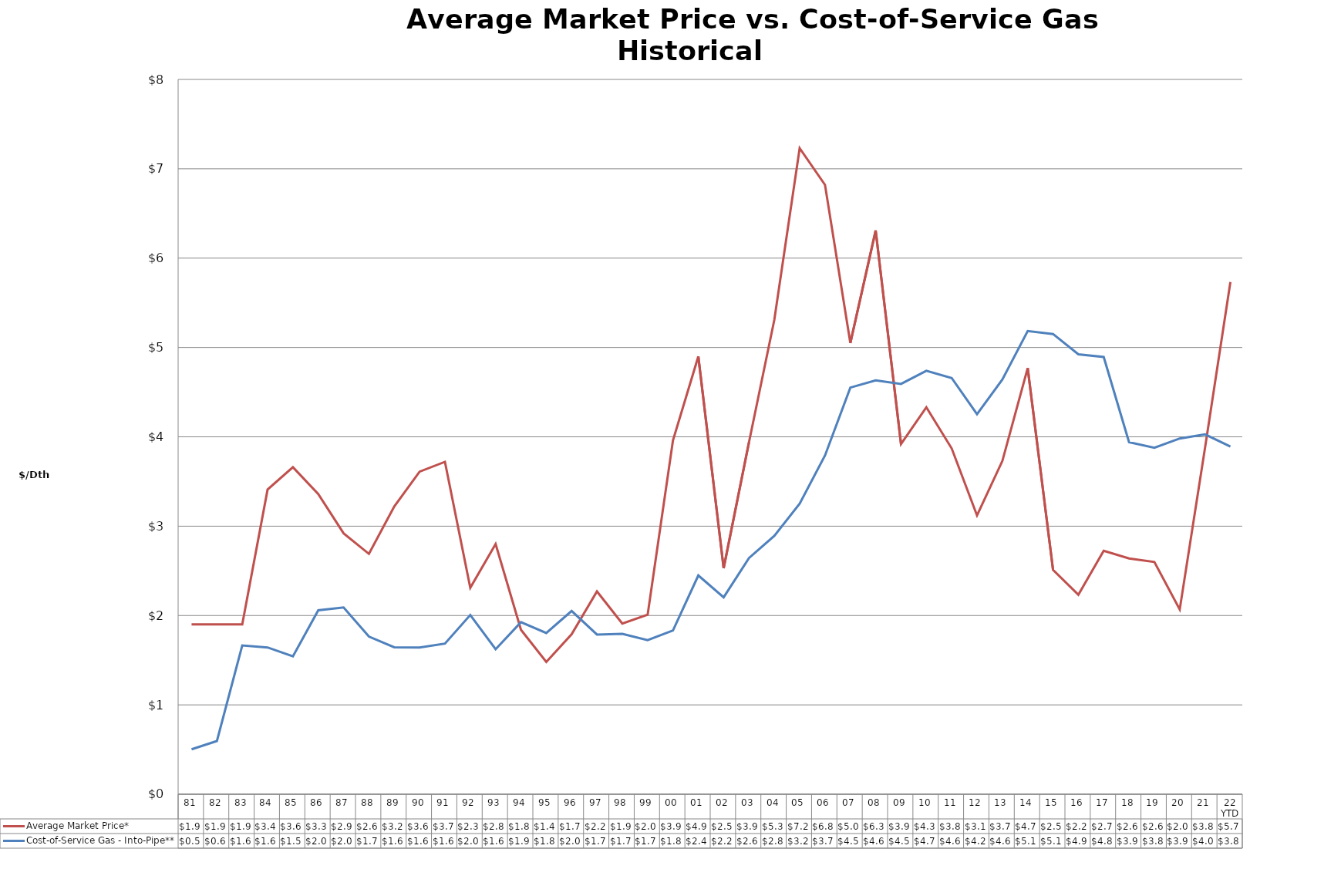
| Category | Average Market Price* | Cost-of-Service Gas - Into-Pipe** |
|---|---|---|
| 81 | 1.9 | 0.502 |
| 82 | 1.9 | 0.596 |
| 83 | 1.9 | 1.665 |
| 84 | 3.41 | 1.643 |
| 85 | 3.66 | 1.543 |
| 86 | 3.36 | 2.059 |
| 87 | 2.92 | 2.091 |
| 88 | 2.69 | 1.764 |
| 89 | 3.22 | 1.644 |
| 90 | 3.61 | 1.642 |
| 91 | 3.72 | 1.685 |
| 92 | 2.31 | 2.005 |
| 93 | 2.8 | 1.623 |
| 94 | 1.84 | 1.926 |
| 95 | 1.48 | 1.804 |
| 96 | 1.79 | 2.052 |
| 97 | 2.27 | 1.787 |
| 98 | 1.91 | 1.795 |
| 99 | 2.01 | 1.725 |
| 00 | 3.96 | 1.833 |
| 01 | 4.9 | 2.448 |
| 02 | 2.53 | 2.204 |
| 03 | 3.94 | 2.644 |
| 04 | 5.31 | 2.891 |
| 05 | 7.23 | 3.251 |
| 06 | 6.82 | 3.792 |
| 07 | 5.05 | 4.551 |
| 08 | 6.31 | 4.632 |
| 09 | 3.92 | 4.592 |
| 10 | 4.33 | 4.74 |
| 11 | 3.87 | 4.658 |
| 12 | 3.12 | 4.253 |
| 13 | 3.73 | 4.641 |
| 14 | 4.77 | 5.184 |
| 15 | 2.51 | 5.151 |
| 16 | 2.233 | 4.923 |
| 17 | 2.725 | 4.894 |
| 18 | 2.639 | 3.94 |
| 19 | 2.599 | 3.877 |
| 20 | 2.067 | 3.981 |
| 21 | 3.879 | 4.027 |
| 22 YTD | 5.733 | 3.891 |